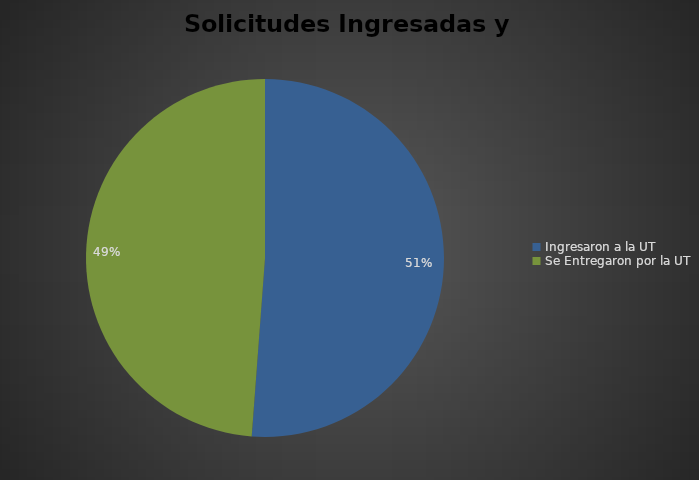
| Category | Series 0 |
|---|---|
| Ingresaron a la UT | 238 |
| Se Entregaron por la UT | 227 |